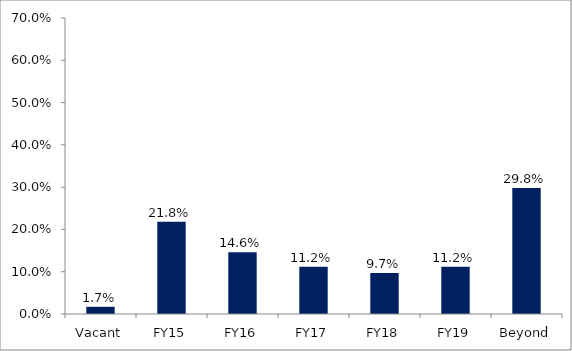
| Category | Series 0 |
|---|---|
| Vacant | 0.017 |
| FY15 | 0.218 |
| FY16 | 0.146 |
| FY17 | 0.112 |
| FY18 | 0.097 |
| FY19 | 0.112 |
| Beyond | 0.298 |